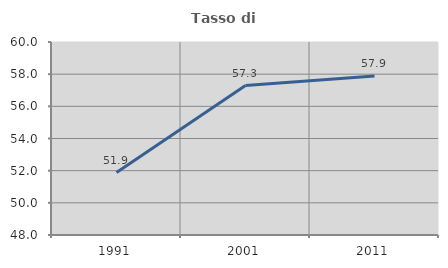
| Category | Tasso di occupazione   |
|---|---|
| 1991.0 | 51.885 |
| 2001.0 | 57.294 |
| 2011.0 | 57.893 |